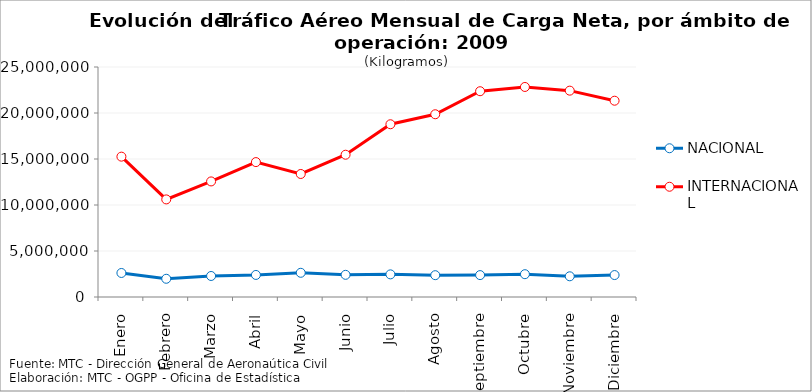
| Category | NACIONAL | INTERNACIONAL |
|---|---|---|
| Enero | 2611459 | 15255638 |
| Febrero | 1980896 | 10607871 |
| Marzo | 2284598 | 12561941 |
| Abril | 2397781 | 14663510 |
| Mayo | 2631323 | 13371886 |
| Junio | 2409811 | 15464407 |
| Julio | 2459534 | 18776909 |
| Agosto | 2371267 | 19863859 |
| Septiembre | 2381039 | 22366583 |
| Octubre | 2479299 | 22830333 |
| Noviembre | 2249855 | 22430111 |
| Diciembre | 2385561 | 21335707 |